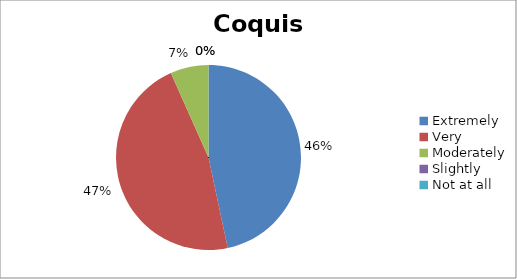
| Category | Coquis |
|---|---|
| Extremely | 7 |
| Very | 7 |
| Moderately | 1 |
| Slightly | 0 |
| Not at all | 0 |